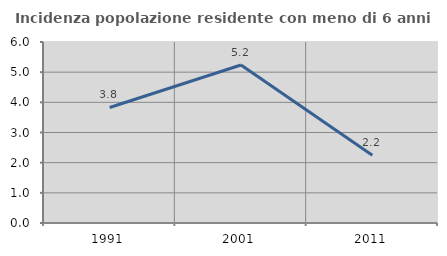
| Category | Incidenza popolazione residente con meno di 6 anni |
|---|---|
| 1991.0 | 3.83 |
| 2001.0 | 5.237 |
| 2011.0 | 2.247 |